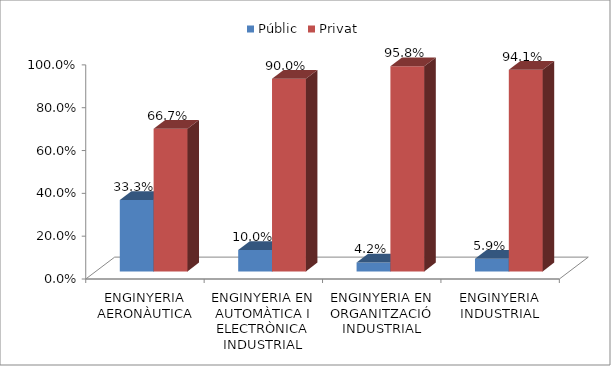
| Category | Públic | Privat |
|---|---|---|
| ENGINYERIA AERONÀUTICA | 0.333 | 0.667 |
| ENGINYERIA EN AUTOMÀTICA I ELECTRÒNICA INDUSTRIAL | 0.1 | 0.9 |
| ENGINYERIA EN ORGANITZACIÓ INDUSTRIAL | 0.042 | 0.958 |
| ENGINYERIA INDUSTRIAL | 0.059 | 0.941 |